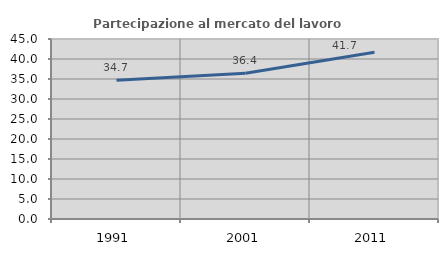
| Category | Partecipazione al mercato del lavoro  femminile |
|---|---|
| 1991.0 | 34.707 |
| 2001.0 | 36.437 |
| 2011.0 | 41.667 |